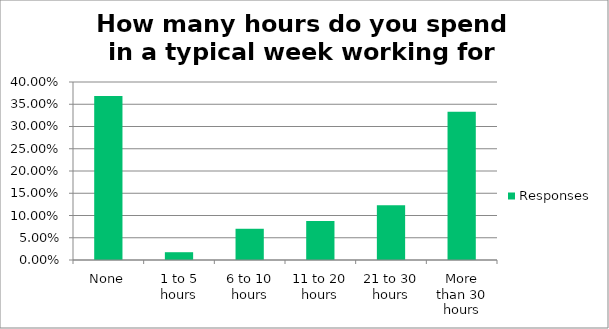
| Category | Responses |
|---|---|
| None | 0.368 |
| 1 to 5 hours | 0.018 |
| 6 to 10 hours | 0.07 |
| 11 to 20 hours | 0.088 |
| 21 to 30 hours | 0.123 |
| More than 30 hours | 0.333 |